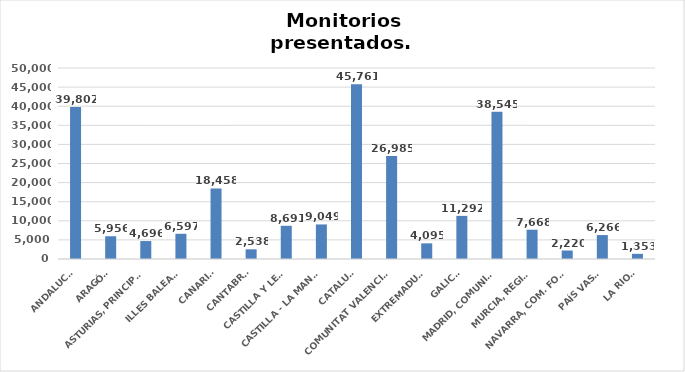
| Category | Series 0 |
|---|---|
| ANDALUCÍA | 39802 |
| ARAGÓN | 5956 |
| ASTURIAS, PRINCIPADO | 4696 |
| ILLES BALEARS | 6597 |
| CANARIAS | 18458 |
| CANTABRIA | 2538 |
| CASTILLA Y LEÓN | 8691 |
| CASTILLA - LA MANCHA | 9049 |
| CATALUÑA | 45761 |
| COMUNITAT VALENCIANA | 26985 |
| EXTREMADURA | 4095 |
| GALICIA | 11292 |
| MADRID, COMUNIDAD | 38545 |
| MURCIA, REGIÓN | 7668 |
| NAVARRA, COM. FORAL | 2220 |
| PAÍS VASCO | 6266 |
| LA RIOJA | 1353 |